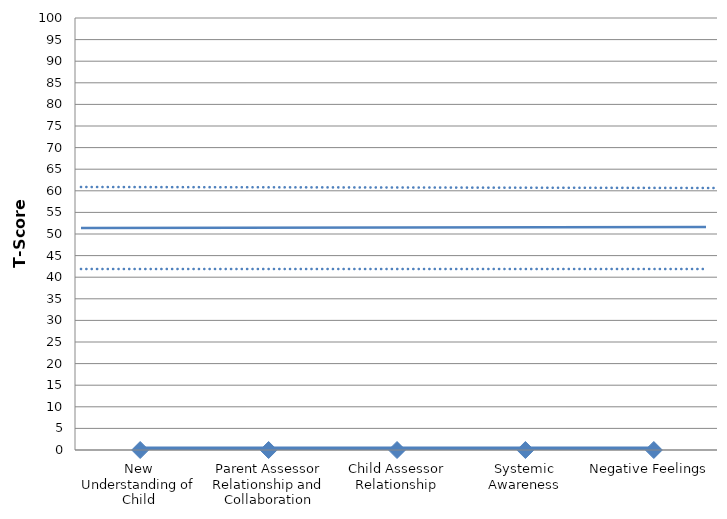
| Category | Series 0 |
|---|---|
| New Understanding of Child | 0 |
| Parent Assessor Relationship and Collaboration | 0 |
| Child Assessor Relationship | 0 |
| Systemic Awareness | 0 |
| Negative Feelings  | 0 |